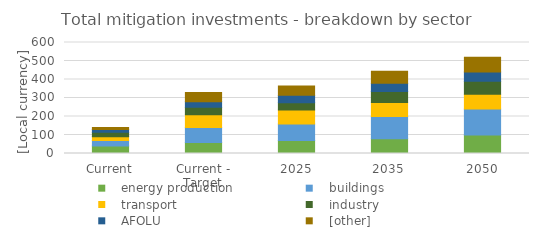
| Category |    energy production |    buildings |    transport |    industry |    AFOLU |    [other] |
|---|---|---|---|---|---|---|
| Current | 40 | 30 | 20 | 25 | 15 | 10 |
| Current - Target | 60 | 80 | 70 | 40 | 30 | 50 |
| 2025 | 70 | 90 | 75 | 40 | 40 | 50 |
| 2035 | 80 | 120 | 75 | 60 | 45 | 65 |
| 2050 | 100 | 140 | 80 | 70 | 50 | 80 |